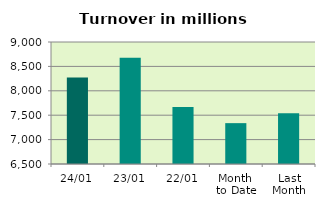
| Category | Series 0 |
|---|---|
| 24/01 | 8271.246 |
| 23/01 | 8675.199 |
| 22/01 | 7666.939 |
| Month 
to Date | 7337.346 |
| Last
Month | 7540.813 |